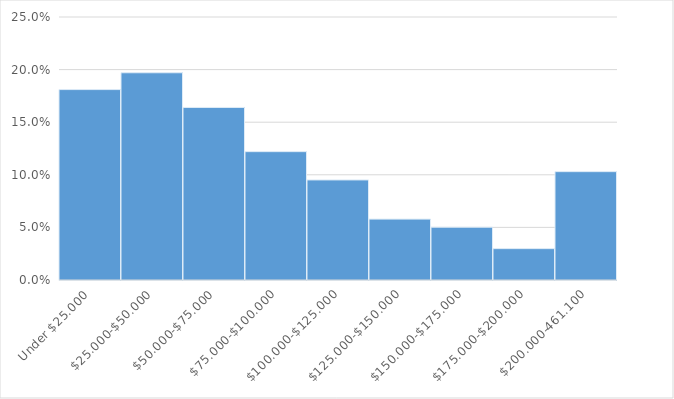
| Category | Series 0 |
|---|---|
|  Under $25.000 | 0.181 |
|  $25.000-$50.000 | 0.197 |
|  $50.000-$75.000 | 0.164 |
|  $75.000-$100.000 | 0.122 |
|  $100.000-$125.000 | 0.095 |
|  $125.000-$150.000 | 0.058 |
|  $150.000-$175.000 | 0.05 |
|  $175.000-$200.000 | 0.03 |
|  $200.000-461.100 | 0.103 |